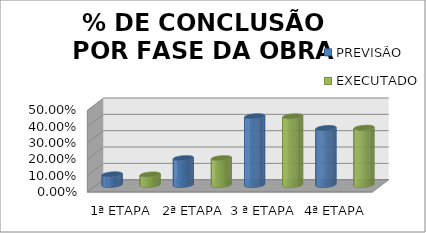
| Category | PREVISÃO | Series 1 | EXECUTADO |
|---|---|---|---|
| 1ª ETAPA | 0.066 |  | 0.065 |
| 2ª ETAPA | 0.165 |  | 0.165 |
| 3 ª ETAPA | 0.421 |  | 0.42 |
| 4ª ETAPA | 0.349 |  | 0.35 |